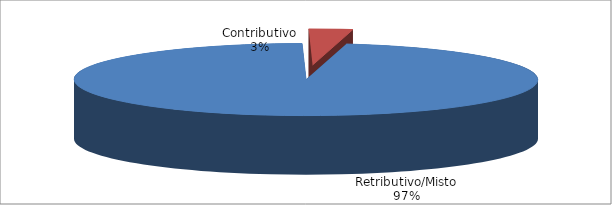
| Category | Series 1 |
|---|---|
| Retributivo/Misto | 37488 |
| Contributivo | 1179 |